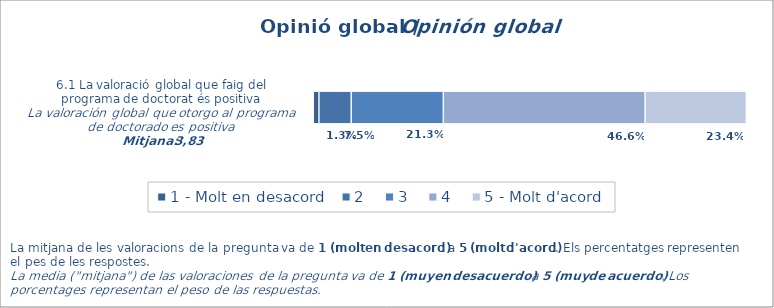
| Category | 1 - Molt en desacord | 2 | 3 | 4 | 5 - Molt d'acord |
|---|---|---|---|---|---|
| 1.0 | 0.013 | 0.075 | 0.213 | 0.466 | 0.234 |